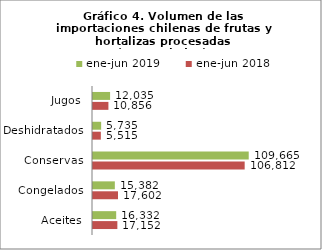
| Category | ene-jun 2018 | ene-jun 2019 |
|---|---|---|
| Aceites | 17151800.212 | 16331810.774 |
| Congelados | 17601999.7 | 15382257.319 |
| Conservas | 106812183.975 | 109665308.469 |
| Deshidratados | 5515209.51 | 5735444.277 |
| Jugos | 10855601.655 | 12034586.631 |